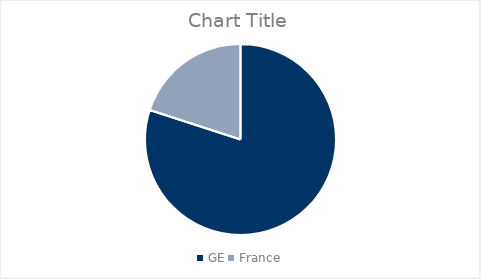
| Category | Series 0 |
|---|---|
| GE | 80 |
| France | 20 |